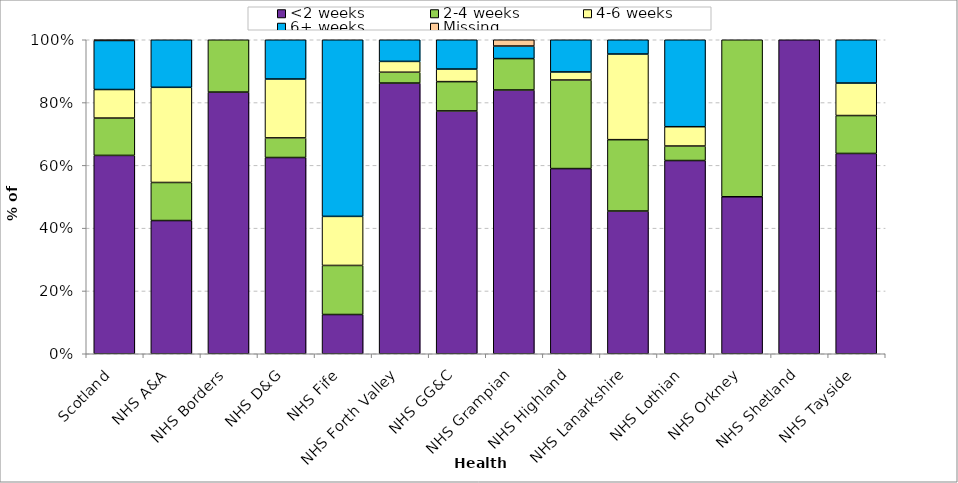
| Category | <2 weeks | 2-4 weeks | 4-6 weeks | 6+ weeks | Missing |
|---|---|---|---|---|---|
| Scotland | 0.632 | 0.119 | 0.091 | 0.156 | 0.002 |
| NHS A&A | 0.424 | 0.121 | 0.303 | 0.152 | 0 |
| NHS Borders | 0.833 | 0.167 | 0 | 0 | 0 |
| NHS D&G | 0.625 | 0.062 | 0.188 | 0.125 | 0 |
| NHS Fife | 0.125 | 0.156 | 0.156 | 0.562 | 0 |
| NHS Forth Valley | 0.862 | 0.034 | 0.034 | 0.069 | 0 |
| NHS GG&C | 0.773 | 0.093 | 0.04 | 0.093 | 0 |
| NHS Grampian | 0.84 | 0.1 | 0 | 0.04 | 0.02 |
| NHS Highland | 0.59 | 0.282 | 0.026 | 0.103 | 0 |
| NHS Lanarkshire | 0.455 | 0.227 | 0.273 | 0.045 | 0 |
| NHS Lothian | 0.615 | 0.046 | 0.062 | 0.277 | 0 |
| NHS Orkney | 0.5 | 0.5 | 0 | 0 | 0 |
| NHS Shetland | 1 | 0 | 0 | 0 | 0 |
| NHS Tayside | 0.638 | 0.121 | 0.103 | 0.138 | 0 |